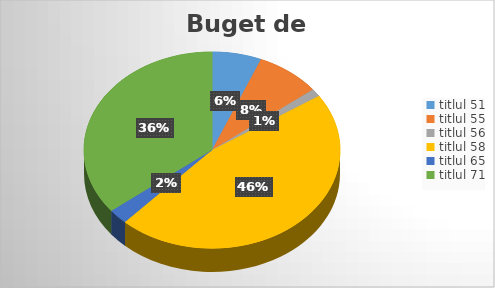
| Category | Series 0 |
|---|---|
| titlul 51 | 1339809 |
| titlul 55 | 1766985 |
| titlul 56 | 269689 |
| titlul 58 | 9948765 |
| titlul 65 | 530681 |
| titlul 71 | 7673615 |